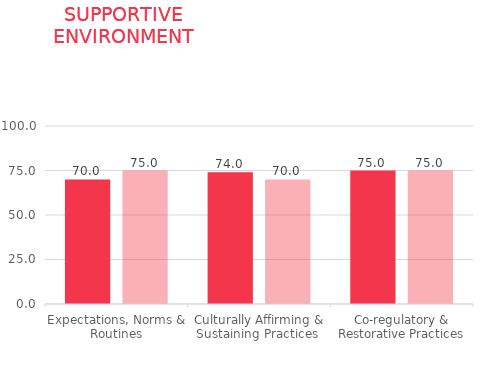
| Category | Time 1 | Time 2 |
|---|---|---|
| Expectations, Norms & Routines | 70 | 75 |
| Culturally Affirming & Sustaining Practices  | 74 | 70 |
| Co-regulatory & Restorative Practices | 75 | 75 |